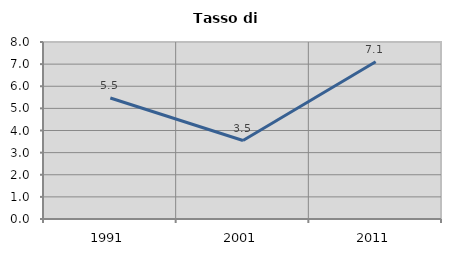
| Category | Tasso di disoccupazione   |
|---|---|
| 1991.0 | 5.469 |
| 2001.0 | 3.546 |
| 2011.0 | 7.104 |